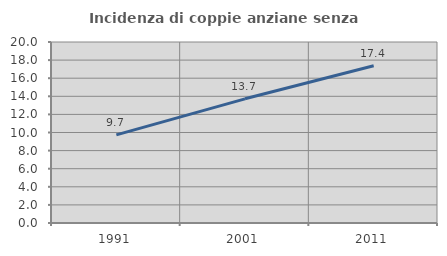
| Category | Incidenza di coppie anziane senza figli  |
|---|---|
| 1991.0 | 9.732 |
| 2001.0 | 13.721 |
| 2011.0 | 17.373 |